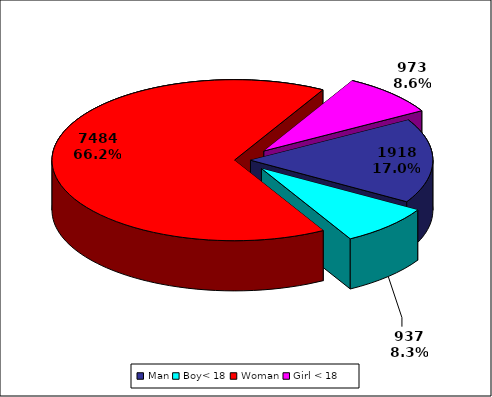
| Category | TOTAL |
|---|---|
| Man | 1918 |
| Boy< 18 | 937 |
| Woman | 7484 |
| Girl < 18 | 973 |